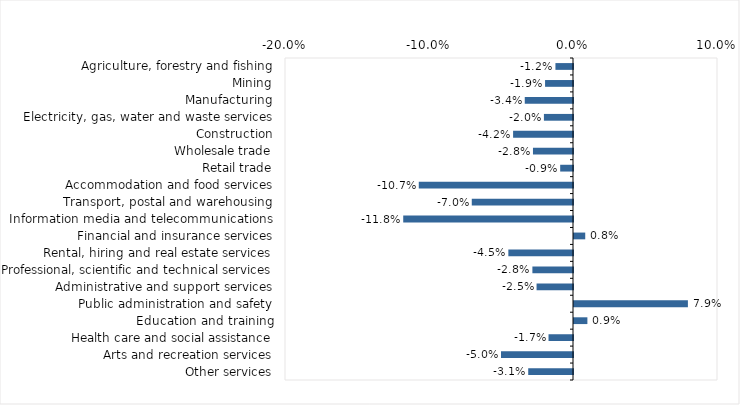
| Category | This week |
|---|---|
| Agriculture, forestry and fishing | -0.012 |
| Mining | -0.019 |
| Manufacturing | -0.034 |
| Electricity, gas, water and waste services | -0.02 |
| Construction | -0.042 |
| Wholesale trade | -0.028 |
| Retail trade | -0.009 |
| Accommodation and food services | -0.107 |
| Transport, postal and warehousing | -0.07 |
| Information media and telecommunications | -0.118 |
| Financial and insurance services | 0.008 |
| Rental, hiring and real estate services | -0.045 |
| Professional, scientific and technical services | -0.028 |
| Administrative and support services | -0.025 |
| Public administration and safety | 0.079 |
| Education and training | 0.009 |
| Health care and social assistance | -0.017 |
| Arts and recreation services | -0.05 |
| Other services | -0.031 |